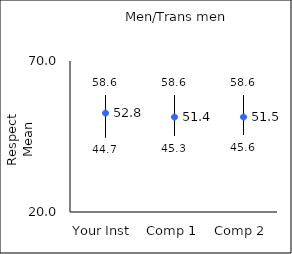
| Category | 25th percentile | 75th percentile | Mean |
|---|---|---|---|
| Your Inst | 44.7 | 58.6 | 52.75 |
| Comp 1 | 45.3 | 58.6 | 51.44 |
| Comp 2 | 45.6 | 58.6 | 51.45 |